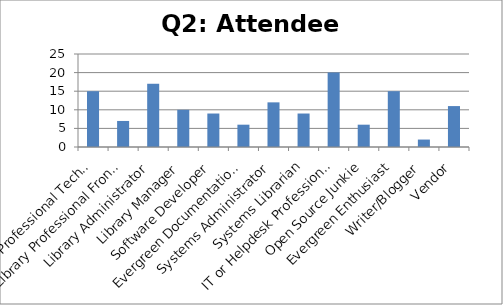
| Category | Response percent |
|---|---|
| Library Professional Tech Services | 15 |
| Library Professional Front-Line Staff | 7 |
| Library Administrator | 17 |
| Library Manager | 10 |
| Software Developer | 9 |
| Evergreen Documentation Producer | 6 |
| Systems Administrator | 12 |
| Systems Librarian | 9 |
| IT or Helpdesk Professional | 20 |
| Open Source Junkie | 6 |
| Evergreen Enthusiast | 15 |
| Writer/Blogger | 2 |
| Vendor | 11 |